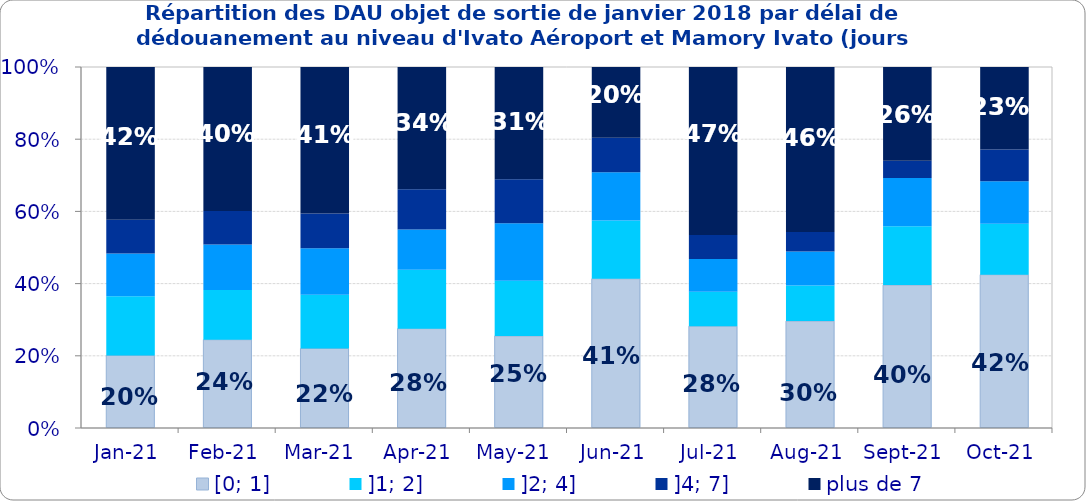
| Category | [0; 1] | ]1; 2] | ]2; 4] | ]4; 7] | plus de 7 |
|---|---|---|---|---|---|
| 2021-01-01 | 0.201 | 0.164 | 0.118 | 0.093 | 0.423 |
| 2021-02-01 | 0.244 | 0.138 | 0.126 | 0.093 | 0.399 |
| 2021-03-01 | 0.22 | 0.149 | 0.128 | 0.097 | 0.406 |
| 2021-04-01 | 0.275 | 0.163 | 0.112 | 0.112 | 0.339 |
| 2021-05-01 | 0.255 | 0.153 | 0.159 | 0.122 | 0.311 |
| 2021-06-01 | 0.413 | 0.161 | 0.133 | 0.096 | 0.196 |
| 2021-07-01 | 0.282 | 0.095 | 0.09 | 0.067 | 0.465 |
| 2021-08-01 | 0.296 | 0.099 | 0.094 | 0.054 | 0.457 |
| 2021-09-01 | 0.396 | 0.163 | 0.133 | 0.048 | 0.26 |
| 2021-10-01 | 0.425 | 0.141 | 0.118 | 0.087 | 0.229 |